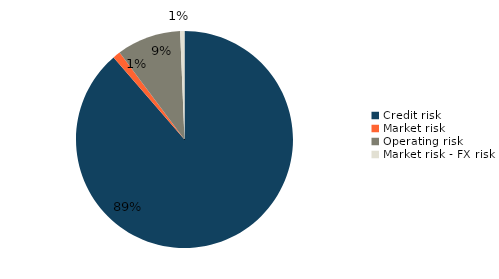
| Category | Series 1 | Series 0 |
|---|---|---|
| Credit risk | 0.887 | 0.887 |
| Market risk | 0.011 | 0.011 |
| Operating risk | 0.096 | 0.096 |
| Market risk - FX risk | 0.006 | 0.006 |